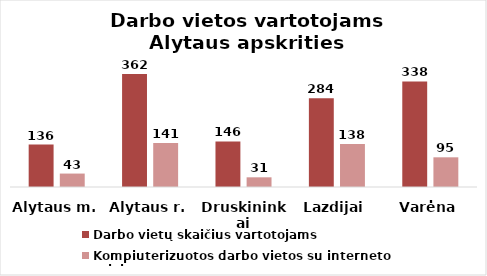
| Category | Darbo vietų skaičius vartotojams | Kompiuterizuotos darbo vietos su interneto prieiga |
|---|---|---|
| Alytaus m. | 136 | 43 |
| Alytaus r. | 362 | 141 |
| Druskininkai | 146 | 31 |
| Lazdijai | 284 | 138 |
| Varėna | 338 | 95 |